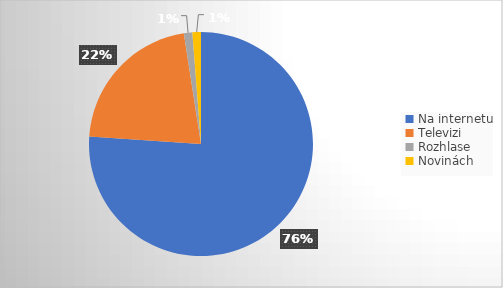
| Category | Series 0 |
|---|---|
| Na internetu | 124 |
| Televizi | 35 |
| Rozhlase | 2 |
| Novinách | 2 |